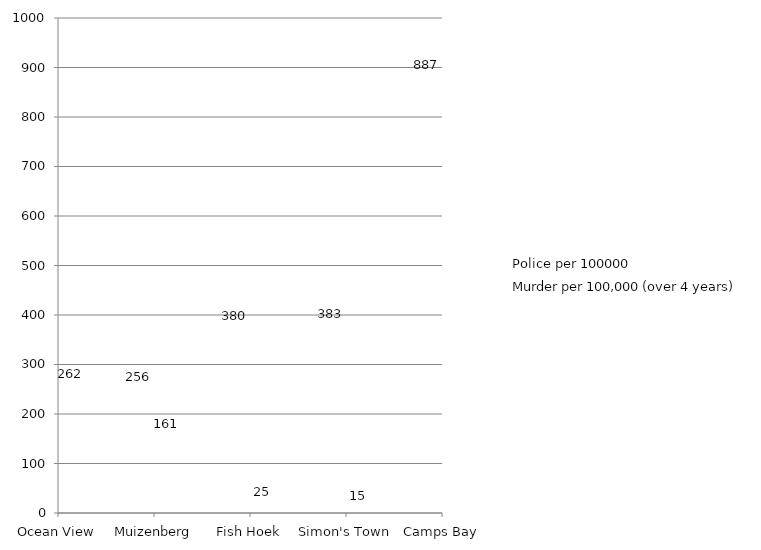
| Category | Police per 100000 | Murder per 100,000 (over 4 years) |
|---|---|---|
| Ocean View | 217.866 | 262.429 |
| Muizenberg | 255.968 | 161.039 |
| Fish Hoek | 379.549 | 24.646 |
| Simon's Town | 383.348 | 15.334 |
| Camps Bay | 887.094 | 36.208 |